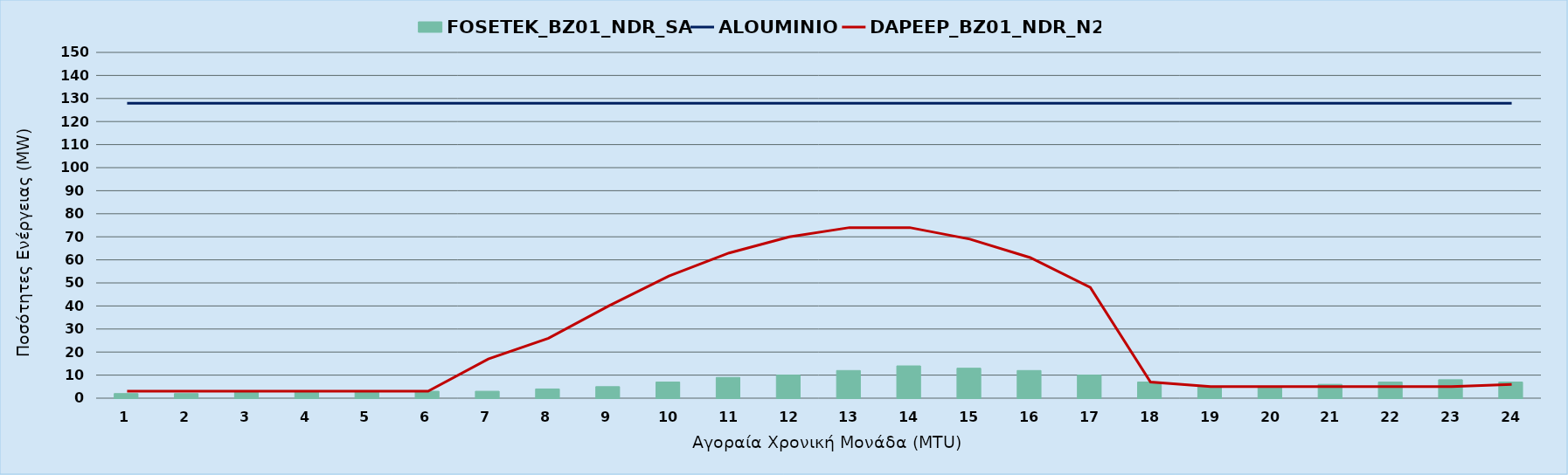
| Category | FOSETEK_BZ01_NDR_SA |
|---|---|
| 0 | 2 |
| 1 | 2 |
| 2 | 3 |
| 3 | 3 |
| 4 | 3 |
| 5 | 3 |
| 6 | 3 |
| 7 | 4 |
| 8 | 5 |
| 9 | 7 |
| 10 | 9 |
| 11 | 10 |
| 12 | 12 |
| 13 | 14 |
| 14 | 13 |
| 15 | 12 |
| 16 | 10 |
| 17 | 7 |
| 18 | 5 |
| 19 | 5 |
| 20 | 6 |
| 21 | 7 |
| 22 | 8 |
| 23 | 7 |